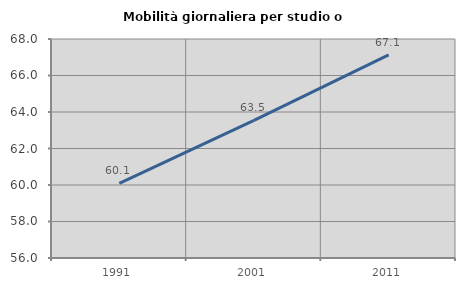
| Category | Mobilità giornaliera per studio o lavoro |
|---|---|
| 1991.0 | 60.087 |
| 2001.0 | 63.545 |
| 2011.0 | 67.134 |